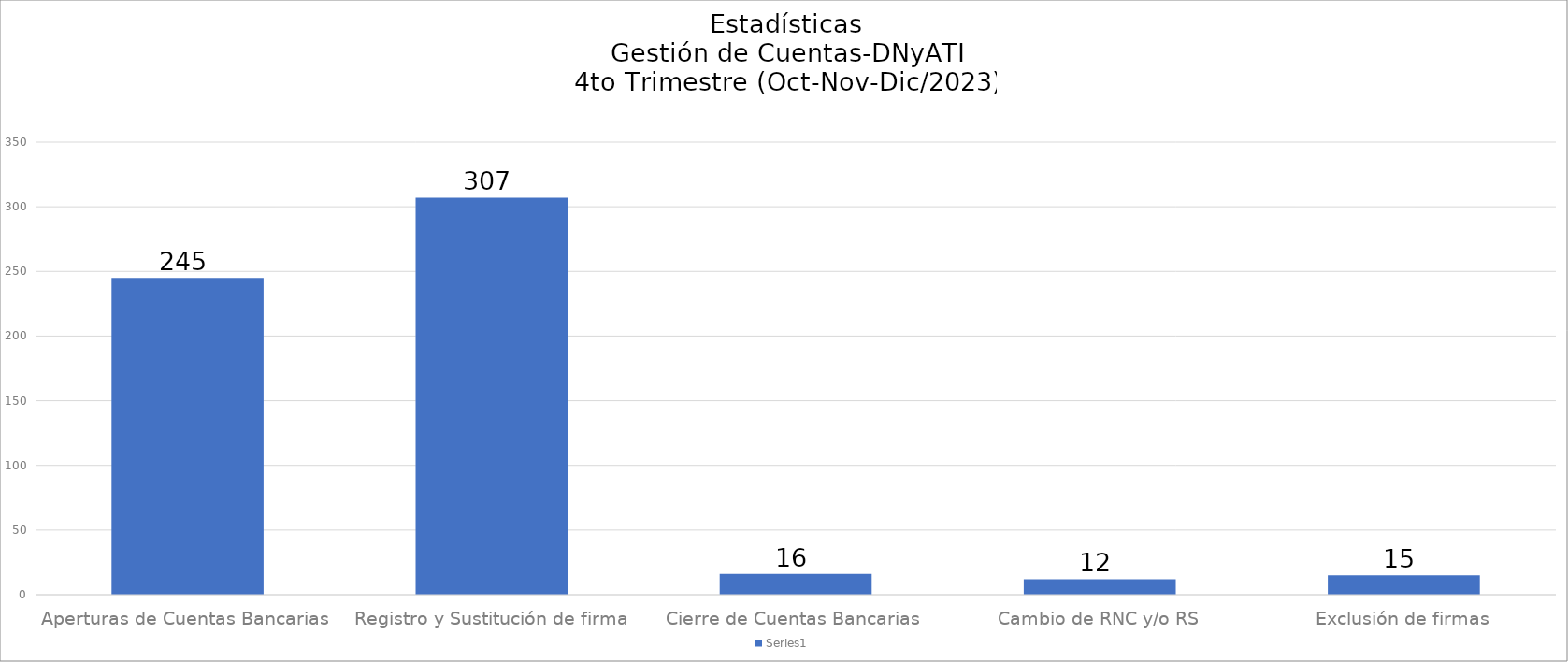
| Category | Series 0 |
|---|---|
| Aperturas de Cuentas Bancarias  | 245 |
| Registro y Sustitución de firma | 307 |
| Cierre de Cuentas Bancarias  | 16 |
| Cambio de RNC y/o RS | 12 |
| Exclusión de firmas | 15 |